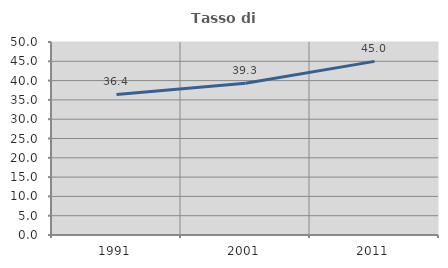
| Category | Tasso di occupazione   |
|---|---|
| 1991.0 | 36.413 |
| 2001.0 | 39.322 |
| 2011.0 | 44.978 |